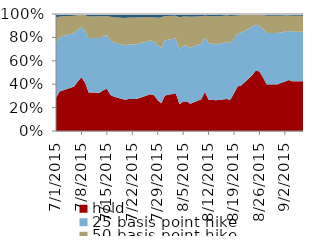
| Category | hold | 25 basis point hike | 50 basis point hike | 75 basis point hike |
|---|---|---|---|---|
| 2015-07-01 | 28.294 | 46.832 | 21.58 | 3.168 |
| 2015-07-02 | 33.806 | 46.59 | 17.474 | 2.059 |
| 2015-07-06 | 38.119 | 45.391 | 14.907 | 1.534 |
| 2015-07-07 | 42.394 | 44.313 | 12.218 | 1.05 |
| 2015-07-08 | 45.878 | 43.03 | 10.323 | 0.753 |
| 2015-07-09 | 41.332 | 44.532 | 12.966 | 1.142 |
| 2015-07-10 | 32.846 | 46.6 | 18.323 | 2.169 |
| 2015-07-13 | 32.66 | 46.807 | 18.463 | 2.015 |
| 2015-07-14 | 34.836 | 46.241 | 17.058 | 1.816 |
| 2015-07-15 | 36.081 | 45.67 | 16.463 | 1.738 |
| 2015-07-16 | 30.793 | 46.798 | 20.087 | 2.26 |
| 2015-07-17 | 29.196 | 46.491 | 21.508 | 2.726 |
| 2015-07-20 | 26.617 | 46.326 | 23.599 | 3.356 |
| 2015-07-21 | 27.236 | 46.683 | 23.012 | 2.981 |
| 2015-07-22 | 27.236 | 46.683 | 23.012 | 2.981 |
| 2015-07-23 | 27.236 | 46.683 | 23.012 | 2.981 |
| 2015-07-24 | 28.284 | 46.464 | 22.303 | 2.864 |
| 2015-07-27 | 31.359 | 45.93 | 20.134 | 2.504 |
| 2015-07-28 | 30.573 | 45.892 | 20.603 | 2.824 |
| 2015-07-29 | 26.358 | 46.595 | 23.83 | 3.126 |
| 2015-07-30 | 23.795 | 47.174 | 26.266 | 2.765 |
| 2015-07-31 | 30.24 | 47.28 | 20.72 | 1.76 |
| 2015-08-03 | 32.364 | 46.868 | 19.172 | 1.596 |
| 2015-08-04 | 22.88 | 47.12 | 27.12 | 2.88 |
| 2015-08-05 | 25.2 | 47.8 | 24.8 | 2.2 |
| 2015-08-06 | 25.2 | 47.8 | 24.8 | 2.2 |
| 2015-08-07 | 23.184 | 48.008 | 26.432 | 2.376 |
| 2015-08-10 | 27.144 | 47.728 | 23.112 | 2.016 |
| 2015-08-11 | 33.48 | 46.56 | 18.44 | 1.52 |
| 2015-08-12 | 26.79 | 48.109 | 23.411 | 1.69 |
| 2015-08-13 | 26.68 | 48.32 | 23.32 | 1.68 |
| 2015-08-14 | 26.208 | 47.696 | 23.984 | 2.112 |
| 2015-08-17 | 27.373 | 48.522 | 22.838 | 1.267 |
| 2015-08-18 | 26.79 | 48.109 | 23.411 | 1.69 |
| 2015-08-19 | 32.364 | 46.868 | 19.172 | 1.596 |
| 2015-08-20 | 37.944 | 45.328 | 15.512 | 1.216 |
| 2015-08-21 | 38.861 | 45.258 | 14.902 | 0.979 |
| 2015-08-24 | 47.693 | 41.242 | 10.438 | 0.627 |
| 2015-08-25 | 51.741 | 39.018 | 8.742 | 0.499 |
| 2015-08-26 | 50.829 | 39.034 | 9.446 | 0.691 |
| 2015-08-27 | 45.752 | 41.504 | 11.736 | 1.008 |
| 2015-08-28 | 39.655 | 44.194 | 14.646 | 1.505 |
| 2015-08-31 | 39.655 | 44.194 | 14.646 | 1.505 |
| 2015-09-01 | 41.344 | 42.848 | 14.272 | 1.536 |
| 2015-09-02 | 42.106 | 43.043 | 13.597 | 1.254 |
| 2015-09-03 | 43.512 | 42.224 | 13.016 | 1.248 |
| 2015-09-04 | 42.476 | 42.452 | 13.668 | 1.404 |
| 2015-09-07 | 42.624 | 42.208 | 13.712 | 1.456 |